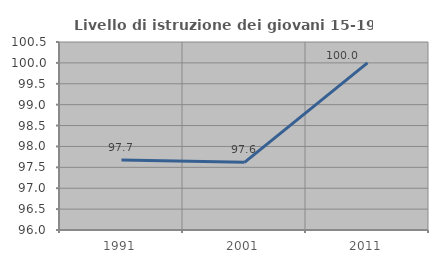
| Category | Livello di istruzione dei giovani 15-19 anni |
|---|---|
| 1991.0 | 97.674 |
| 2001.0 | 97.619 |
| 2011.0 | 100 |